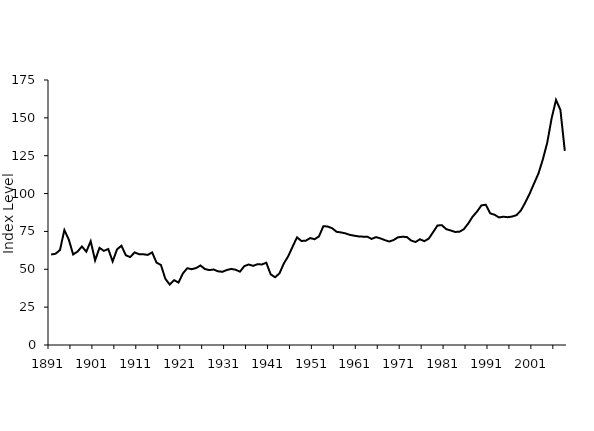
| Category | Series 0 | Series 1 |
|---|---|---|
| 1891.0 | 1891 | 59.756 |
| 1892.0 | 1892 | 60.277 |
| 1893.0 | 1893 | 62.731 |
| 1894.0 | 1894 | 75.882 |
| 1895.0 | 1895 | 69.69 |
| 1896.0 | 1896 | 59.799 |
| 1897.0 | 1897 | 61.689 |
| 1898.0 | 1898 | 65.069 |
| 1899.0 | 1899 | 61.624 |
| 1900.0 | 1900 | 68.534 |
| 1901.0 | 1901 | 55.872 |
| 1902.0 | 1902 | 64.168 |
| 1903.0 | 1903 | 62.171 |
| 1904.0 | 1904 | 63.377 |
| 1905.0 | 1905 | 55.183 |
| 1906.0 | 1906 | 63.164 |
| 1907.0 | 1907 | 65.566 |
| 1908.0 | 1908 | 59.254 |
| 1909.0 | 1909 | 58.074 |
| 1910.0 | 1910 | 61.126 |
| 1911.0 | 1911 | 59.98 |
| 1912.0 | 1912 | 59.914 |
| 1913.0 | 1913 | 59.507 |
| 1914.0 | 1914 | 61.14 |
| 1915.0 | 1915 | 54.375 |
| 1916.0 | 1916 | 52.856 |
| 1917.0 | 1917 | 43.723 |
| 1918.0 | 1918 | 39.922 |
| 1919.0 | 1919 | 42.837 |
| 1920.0 | 1920 | 41.224 |
| 1921.0 | 1921 | 47.272 |
| 1922.0 | 1922 | 50.72 |
| 1923.0 | 1923 | 50.054 |
| 1924.0 | 1924 | 50.785 |
| 1925.0 | 1925 | 52.506 |
| 1926.0 | 1926 | 50.176 |
| 1927.0 | 1927 | 49.487 |
| 1928.0 | 1928 | 49.846 |
| 1929.0 | 1929 | 48.658 |
| 1930.0 | 1930 | 48.342 |
| 1931.0 | 1931 | 49.512 |
| 1932.0 | 1932 | 50.26 |
| 1933.0 | 1933 | 49.707 |
| 1934.0 | 1934 | 48.422 |
| 1935.0 | 1935 | 52.094 |
| 1936.0 | 1936 | 53.159 |
| 1937.0 | 1937 | 52.253 |
| 1938.0 | 1938 | 53.383 |
| 1939.0 | 1939 | 53.177 |
| 1940.0 | 1940 | 54.32 |
| 1941.0 | 1941 | 46.673 |
| 1942.0 | 1942 | 44.722 |
| 1943.0 | 1943 | 47.284 |
| 1944.0 | 1944 | 53.858 |
| 1945.0 | 1945 | 58.658 |
| 1946.0 | 1946 | 64.991 |
| 1947.0 | 1947 | 71.087 |
| 1948.0 | 1948 | 68.697 |
| 1949.0 | 1949 | 68.884 |
| 1950.0 | 1950 | 70.615 |
| 1951.0 | 1951 | 69.856 |
| 1952.0 | 1952 | 71.72 |
| 1953.0 | 1953 | 78.469 |
| 1954.0 | 1954 | 78.226 |
| 1955.0 | 1955 | 77.121 |
| 1956.0 | 1956 | 74.761 |
| 1957.0 | 1957 | 74.353 |
| 1958.0 | 1958 | 73.74 |
| 1959.0 | 1959 | 72.753 |
| 1960.0 | 1960 | 72.195 |
| 1961.0 | 1961 | 71.725 |
| 1962.0 | 1962 | 71.547 |
| 1963.0 | 1963 | 71.532 |
| 1964.0 | 1964 | 70.067 |
| 1965.0 | 1965 | 71.253 |
| 1966.0 | 1966 | 70.403 |
| 1967.0 | 1967 | 69.264 |
| 1968.0 | 1968 | 68.327 |
| 1969.0 | 1969 | 69.317 |
| 1970.0 | 1970 | 71.128 |
| 1971.0 | 1971 | 71.473 |
| 1972.0 | 1972 | 71.318 |
| 1973.0 | 1973 | 68.959 |
| 1974.0 | 1974 | 68.006 |
| 1975.0 | 1975 | 69.824 |
| 1976.0 | 1976 | 68.565 |
| 1977.0 | 1977 | 70.235 |
| 1978.0 | 1978 | 74.508 |
| 1979.0 | 1979 | 78.937 |
| 1980.0 | 1980 | 79.102 |
| 1981.0 | 1981 | 76.492 |
| 1982.0 | 1982 | 75.626 |
| 1983.0 | 1983 | 74.671 |
| 1984.0 | 1984 | 74.779 |
| 1985.0 | 1985 | 76.486 |
| 1986.0 | 1986 | 80.214 |
| 1987.0 | 1987 | 84.74 |
| 1988.0 | 1988 | 88.083 |
| 1989.0 | 1989 | 92.197 |
| 1990.0 | 1990 | 92.634 |
| 1991.0 | 1991 | 86.961 |
| 1992.0 | 1992 | 86.015 |
| 1993.0 | 1993 | 84.25 |
| 1994.0 | 1994 | 84.711 |
| 1995.0 | 1995 | 84.399 |
| 1996.0 | 1996 | 84.827 |
| 1997.0 | 1997 | 85.756 |
| 1998.0 | 1998 | 88.846 |
| 1999.0 | 1999 | 94.084 |
| 2000.0 | 2000 | 100 |
| 2001.0 | 2001 | 106.709 |
| 2002.0 | 2002 | 113.255 |
| 2003.0 | 2003 | 122.62 |
| 2004.0 | 2004 | 133.62 |
| 2005.0 | 2005 | 149.726 |
| 2006.0 | 2006 | 161.834 |
| 2007.0 | 2007 | 155.228 |
| 2008.0 | 2008 | 128.185 |